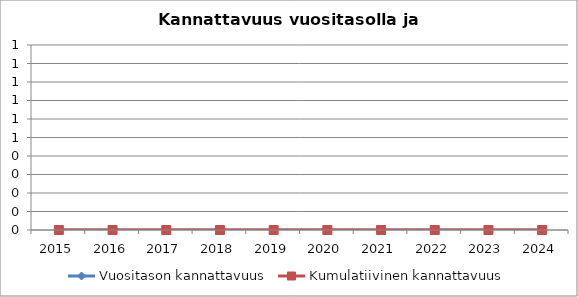
| Category | Vuositason kannattavuus | Kumulatiivinen kannattavuus |
|---|---|---|
| 2015 | 0 | 0 |
| 2016 | 0 | 0 |
| 2017 | 0 | 0 |
| 2018 | 0 | 0 |
| 2019 | 0 | 0 |
| 2020 | 0 | 0 |
| 2021 | 0 | 0 |
| 2022 | 0 | 0 |
| 2023 | 0 | 0 |
| 2024 | 0 | 0 |